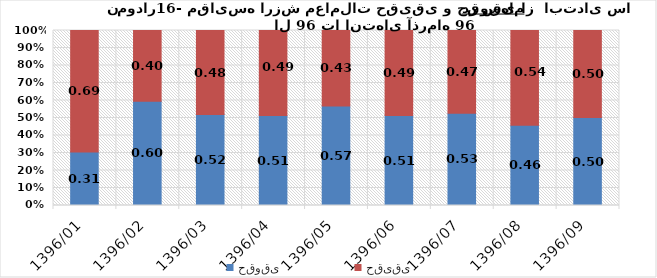
| Category | حقوقی | حقیقی |
|---|---|---|
| 1396/01 | 0.305 | 0.695 |
| 1396/02 | 0.596 | 0.404 |
| 1396/03 | 0.52 | 0.48 |
| 1396/04 | 0.514 | 0.486 |
| 1396/05 | 0.569 | 0.431 |
| 1396/06 | 0.514 | 0.486 |
| 1396/07 | 0.527 | 0.473 |
| 1396/08 | 0.458 | 0.542 |
| 1396/09 | 0.503 | 0.497 |